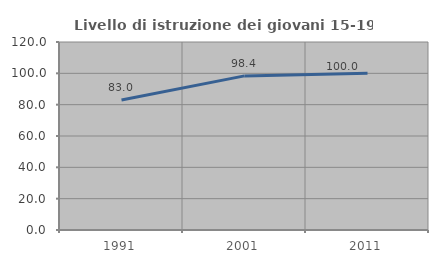
| Category | Livello di istruzione dei giovani 15-19 anni |
|---|---|
| 1991.0 | 83.036 |
| 2001.0 | 98.374 |
| 2011.0 | 100 |